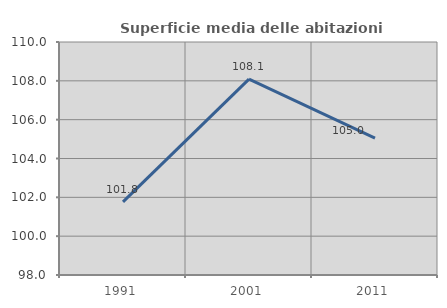
| Category | Superficie media delle abitazioni occupate |
|---|---|
| 1991.0 | 101.764 |
| 2001.0 | 108.088 |
| 2011.0 | 105.045 |